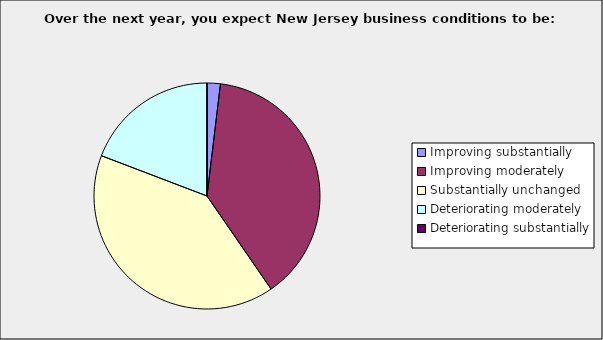
| Category | Series 0 |
|---|---|
| Improving substantially | 0.019 |
| Improving moderately | 0.385 |
| Substantially unchanged | 0.404 |
| Deteriorating moderately | 0.192 |
| Deteriorating substantially | 0 |